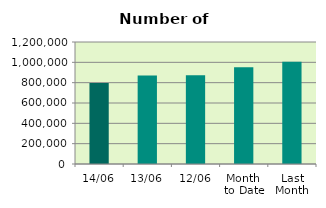
| Category | Series 0 |
|---|---|
| 14/06 | 796694 |
| 13/06 | 871382 |
| 12/06 | 874032 |
| Month 
to Date | 951884.6 |
| Last
Month | 1004730.273 |